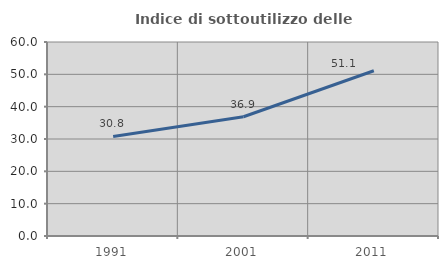
| Category | Indice di sottoutilizzo delle abitazioni  |
|---|---|
| 1991.0 | 30.791 |
| 2001.0 | 36.882 |
| 2011.0 | 51.103 |